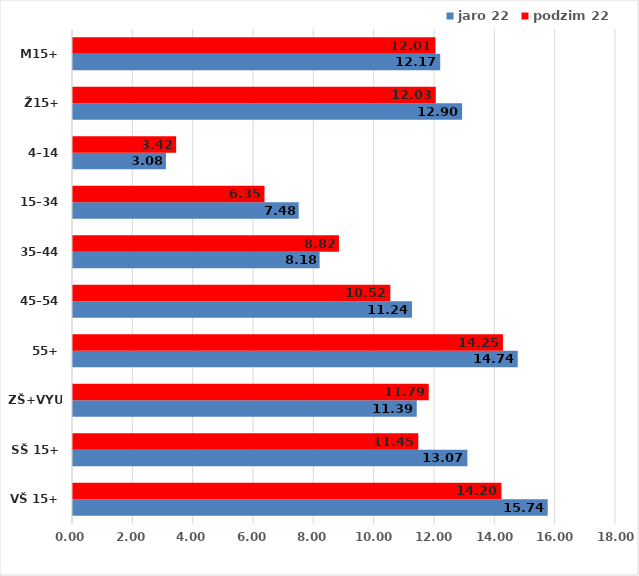
| Category | jaro 22 | podzim 22 |
|---|---|---|
| VŠ 15+ | 15.736 | 14.202 |
| SŠ 15+ | 13.074 | 11.446 |
| ZŠ+VYUČ | 11.394 | 11.792 |
| 55+ | 14.743 | 14.253 |
| 45–54 | 11.236 | 10.519 |
| 35–44 | 8.176 | 8.816 |
| 15–34 | 7.482 | 6.347 |
| 4–14 | 3.08 | 3.419 |
| Ž15+ | 12.899 | 12.026 |
| M15+ | 12.173 | 12.014 |